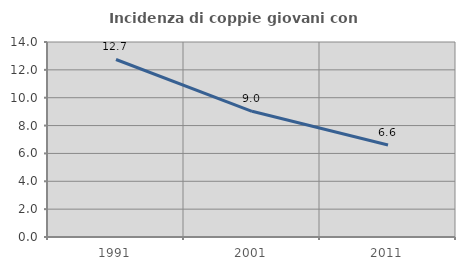
| Category | Incidenza di coppie giovani con figli |
|---|---|
| 1991.0 | 12.745 |
| 2001.0 | 9.025 |
| 2011.0 | 6.605 |